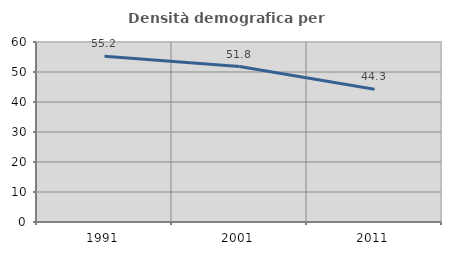
| Category | Densità demografica |
|---|---|
| 1991.0 | 55.245 |
| 2001.0 | 51.8 |
| 2011.0 | 44.273 |